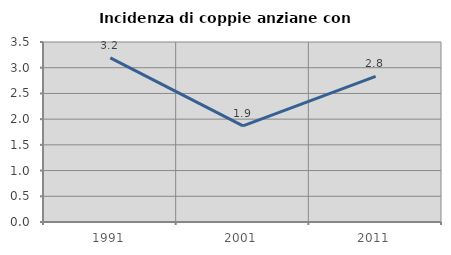
| Category | Incidenza di coppie anziane con figli |
|---|---|
| 1991.0 | 3.191 |
| 2001.0 | 1.869 |
| 2011.0 | 2.83 |